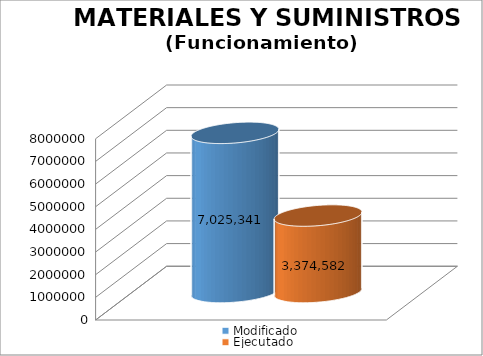
| Category | Modificado | Ejecutado |
|---|---|---|
| 0 | 7025341 | 3374581.54 |